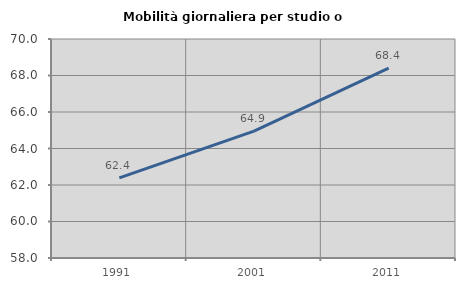
| Category | Mobilità giornaliera per studio o lavoro |
|---|---|
| 1991.0 | 62.39 |
| 2001.0 | 64.948 |
| 2011.0 | 68.41 |